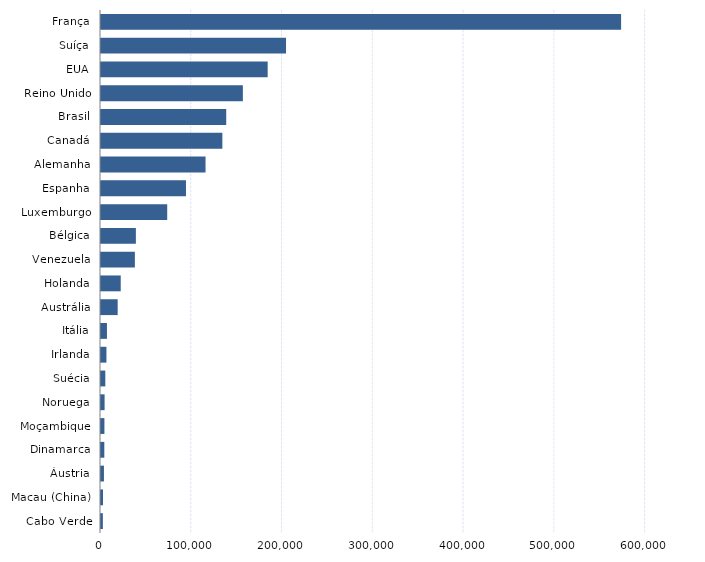
| Category | Series 0 |
|---|---|
| Cabo Verde | 2050 |
| Macau (China) | 2213 |
| Áustria | 3248 |
| Dinamarca | 3656 |
| Moçambique | 3767 |
| Noruega | 3967 |
| Suécia | 4740 |
| Irlanda | 5987 |
| Itália | 6562 |
| Austrália | 18380 |
| Holanda | 21735 |
| Venezuela | 37326 |
| Bélgica | 38423 |
| Luxemburgo | 72948 |
| Espanha | 93621 |
| Alemanha | 115165 |
| Canadá | 133695 |
| Brasil | 137973 |
| Reino Unido | 156295 |
| EUA | 183633 |
| Suíça | 203847 |
| França | 573000 |